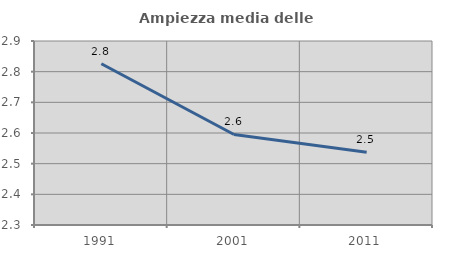
| Category | Ampiezza media delle famiglie |
|---|---|
| 1991.0 | 2.826 |
| 2001.0 | 2.595 |
| 2011.0 | 2.537 |